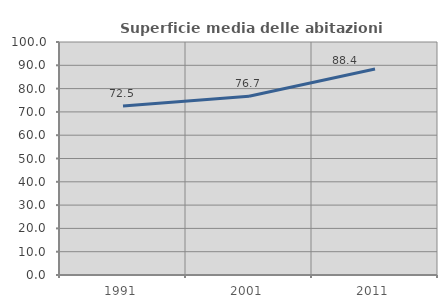
| Category | Superficie media delle abitazioni occupate |
|---|---|
| 1991.0 | 72.497 |
| 2001.0 | 76.679 |
| 2011.0 | 88.447 |